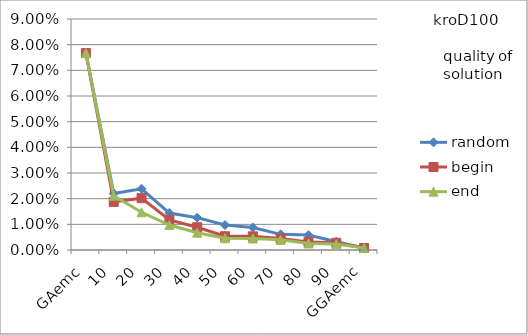
| Category | random | begin | end |
|---|---|---|---|
| 0 | 0.077 | 0.077 | 0.077 |
| 1 | 0.022 | 0.019 | 0.021 |
| 2 | 0.024 | 0.02 | 0.015 |
| 3 | 0.014 | 0.012 | 0.01 |
| 4 | 0.013 | 0.009 | 0.007 |
| 5 | 0.01 | 0.005 | 0.005 |
| 6 | 0.009 | 0.005 | 0.004 |
| 7 | 0.006 | 0.004 | 0.004 |
| 8 | 0.006 | 0.003 | 0.003 |
| 9 | 0.003 | 0.003 | 0.002 |
| 10 | 0.001 | 0.001 | 0.001 |